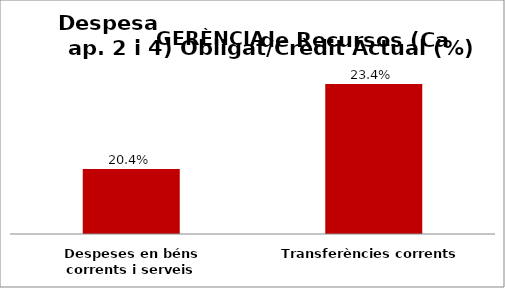
| Category | Series 0 |
|---|---|
| Despeses en béns corrents i serveis | 0.204 |
| Transferències corrents | 0.234 |